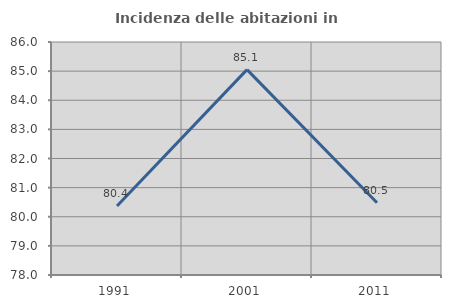
| Category | Incidenza delle abitazioni in proprietà  |
|---|---|
| 1991.0 | 80.369 |
| 2001.0 | 85.052 |
| 2011.0 | 80.483 |